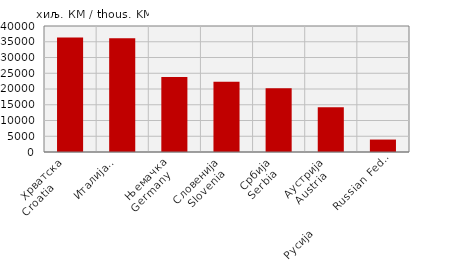
| Category | Извоз
Export |
|---|---|
| Хрватска
Croatia        | 36334 |
| Италија
Italy  | 36139 |
| Њемачка
Germany   | 23782 |
| Словенија
Slovenia  | 22339 |
| Србија
Serbia  | 20275 |
| Аустрија
Austria   | 14240 |
| Русија        Russian Federation | 3950 |